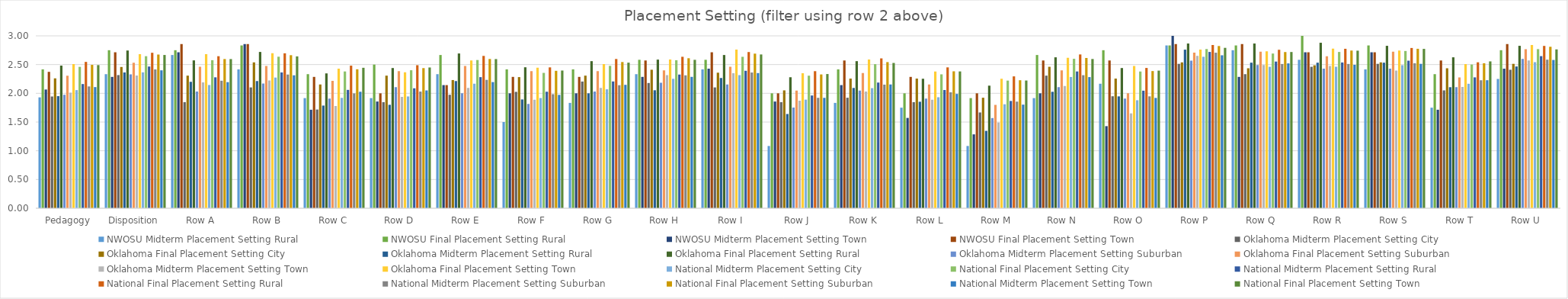
| Category | NWOSU | Oklahoma | National |
|---|---|---|---|
| Pedagogy | 2.374 | 2.509 | 2.491 |
| Disposition | 2.714 | 2.683 | 2.667 |
| Row A | 2.857 | 2.682 | 2.596 |
| Row B | 2.857 | 2.698 | 2.642 |
| Row C | 2.286 | 2.429 | 2.444 |
| Row D | 2 | 2.365 | 2.45 |
| Row E | 2.143 | 2.571 | 2.596 |
| Row F | 2.286 | 2.444 | 2.396 |
| Row G | 2.286 | 2.508 | 2.534 |
| Row H | 2.571 | 2.587 | 2.583 |
| Row I | 2.714 | 2.762 | 2.676 |
| Row J | 2 | 2.349 | 2.336 |
| Row K | 2.571 | 2.587 | 2.528 |
| Row L | 2.286 | 2.381 | 2.381 |
| Row M | 2 | 2.254 | 2.223 |
| Row N | 2.571 | 2.619 | 2.597 |
| Row O | 2.571 | 2.476 | 2.395 |
| Row P | 2.857 | 2.762 | 2.792 |
| Row Q | 2.857 | 2.73 | 2.719 |
| Row R | 2.714 | 2.778 | 2.742 |
| Row S | 2.714 | 2.746 | 2.773 |
| Row T | 2.571 | 2.508 | 2.556 |
| Row U | 2.857 | 2.841 | 2.764 |